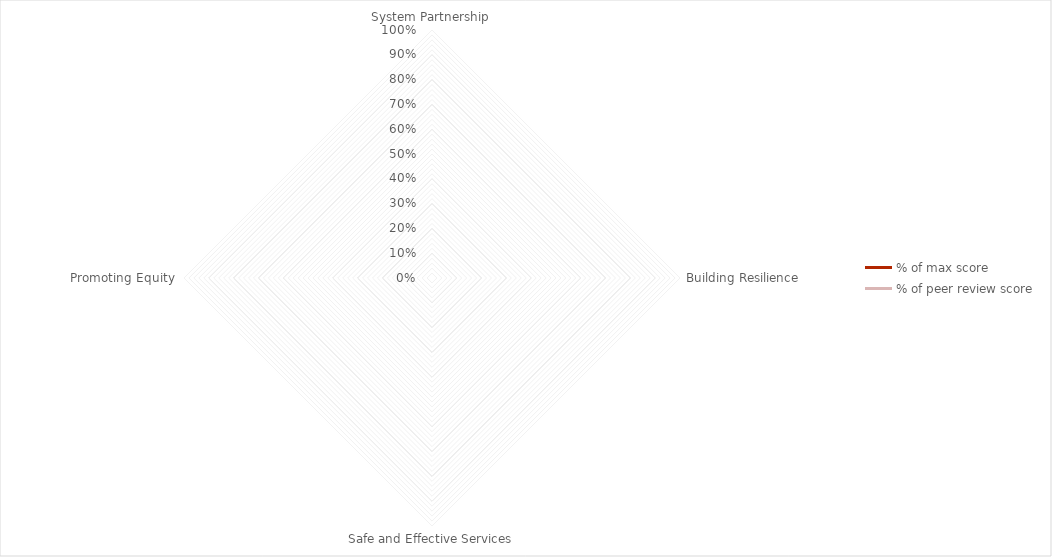
| Category | % of max score | % of peer review score |
|---|---|---|
| System Partnership | 0 | 0 |
| Building Resilience | 0 | 0 |
| Safe and Effective Services | 0 | 0 |
| Promoting Equity | 0 | 0 |